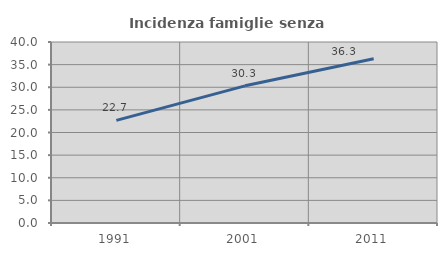
| Category | Incidenza famiglie senza nuclei |
|---|---|
| 1991.0 | 22.691 |
| 2001.0 | 30.312 |
| 2011.0 | 36.295 |